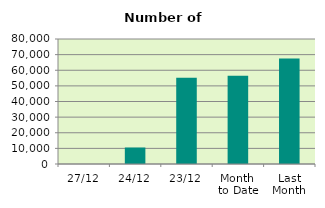
| Category | Series 0 |
|---|---|
| 27/12 | 0 |
| 24/12 | 10560 |
| 23/12 | 55250 |
| Month 
to Date | 56538.667 |
| Last
Month | 67470.455 |